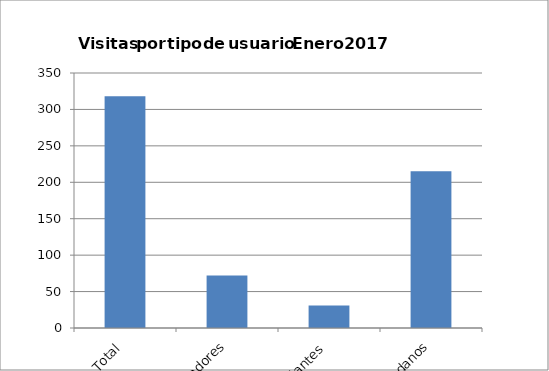
| Category | Series 0 |
|---|---|
| Total | 318 |
| Investigadores | 72 |
| Estudiantes | 31 |
|  Ciudadanos | 215 |